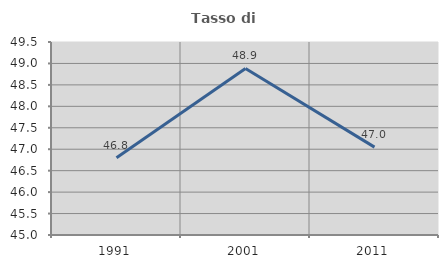
| Category | Tasso di occupazione   |
|---|---|
| 1991.0 | 46.8 |
| 2001.0 | 48.882 |
| 2011.0 | 47.048 |